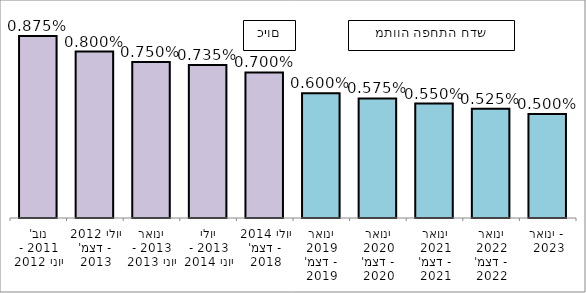
| Category | Series 0 |
|---|---|
| נוב' 2011 - יוני 2012 | 0.009 |
| יולי 2012 - דצמ' 2013 | 0.008 |
| ינואר 2013 - יוני 2013 | 0.008 |
| יולי 2013 - יוני 2014 | 0.007 |
| יולי 2014 - דצמ' 2018 | 0.007 |
| ינואר 2019 - דצמ' 2019 | 0.006 |
| ינואר 2020 - דצמ' 2020 | 0.006 |
| ינואר 2021 - דצמ' 2021 | 0.006 |
| ינואר 2022 - דצמ' 2022 | 0.005 |
| ינואר 2023 -  | 0.005 |